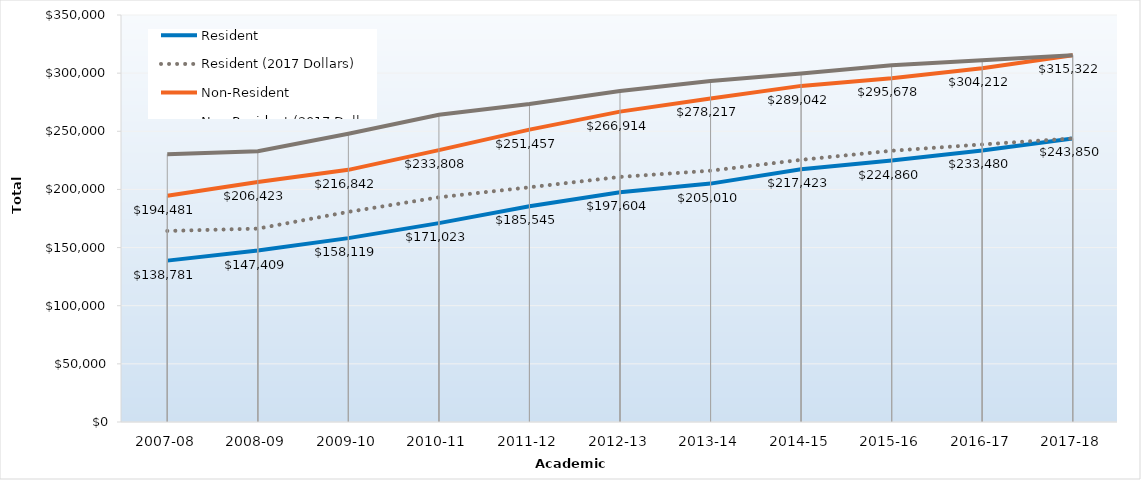
| Category | Resident | Resident (2017 Dollars) | Non-Resident | Non-Resident (2017 Dollars) |
|---|---|---|---|---|
| 2007-08 | 138781 | 164294.63 | 194481 | 230234.57 |
| 2008-09 | 147409 | 166298.76 | 206423 | 232875.12 |
| 2009-10 | 158119 | 180705.44 | 216842 | 247816.7 |
| 2010-11 | 171023 | 193242.63 | 233808 | 264184.77 |
| 2011-12 | 185545 | 201843.33 | 251457 | 273545.06 |
| 2012-13 | 197604 | 210764.68 | 266914 | 284690.81 |
| 2013-14 | 205010 | 216103.26 | 278217 | 293271.56 |
| 2014-15 | 217423 | 225450.16 | 289042 | 299713.3 |
| 2015-16 | 224860.11 | 233246 | 295678.13 | 306705.11 |
| 2016-17 | 233479.65 | 238693.52 | 304212.15 | 311004.94 |
| 2017-18 | 243850 | 243850 | 315322 | 315322 |